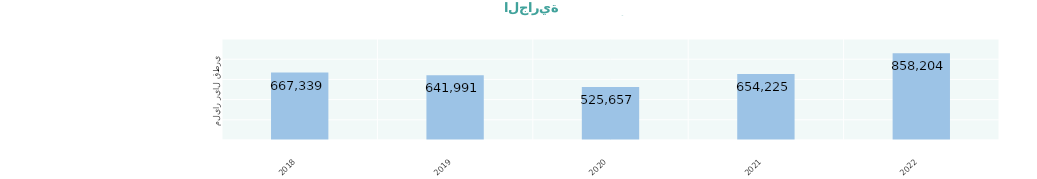
| Category | Series 0 |
|---|---|
| 2018.0 | 667339.232 |
| 2019.0 | 641991.414 |
| 2020.0 | 525657.363 |
| 2021.0 | 654224.515 |
| 2022.0 | 858204.27 |